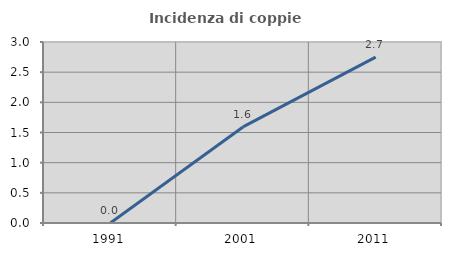
| Category | Incidenza di coppie miste |
|---|---|
| 1991.0 | 0 |
| 2001.0 | 1.592 |
| 2011.0 | 2.749 |